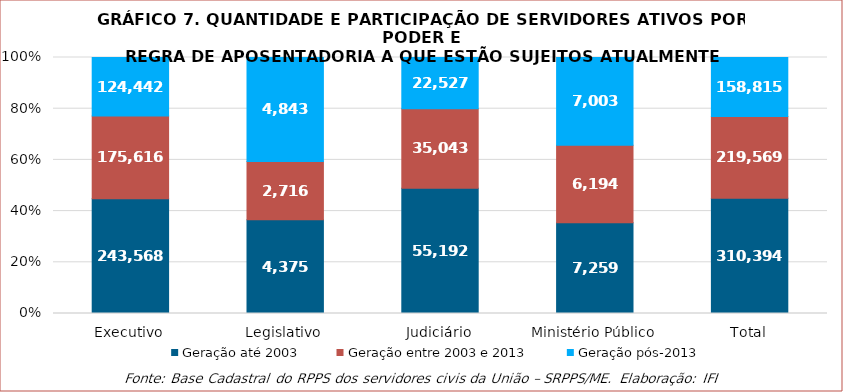
| Category | Geração até 2003 | Geração entre 2003 e 2013 | Geração pós-2013 |
|---|---|---|---|
| Executivo | 243568 | 175616 | 124442 |
| Legislativo | 4375 | 2716 | 4843 |
| Judiciário | 55192 | 35043 | 22527 |
| Ministério Público | 7259 | 6194 | 7003 |
| Total | 310394 | 219569 | 158815 |